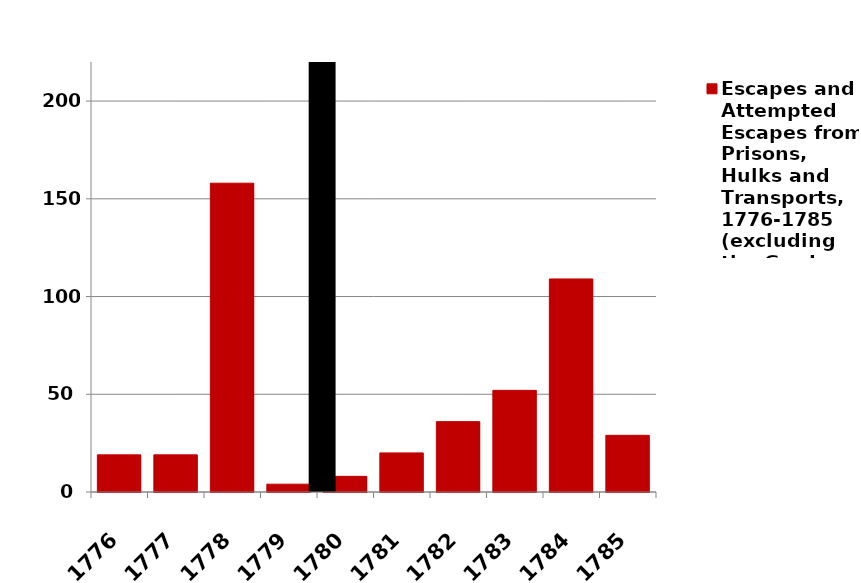
| Category | Escapes and Attempted Escapes from Prisons, Hulks and Transports, 1776-1785 (excluding the Gordon Riots) |
|---|---|
| 1776 | 19 |
| 1777 | 19 |
| 1778 | 158 |
| 1779 | 4 |
| 1780 | 8 |
| 1781 | 20 |
| 1782 | 36 |
| 1783 | 52 |
| 1784 | 109 |
| 1785 | 29 |